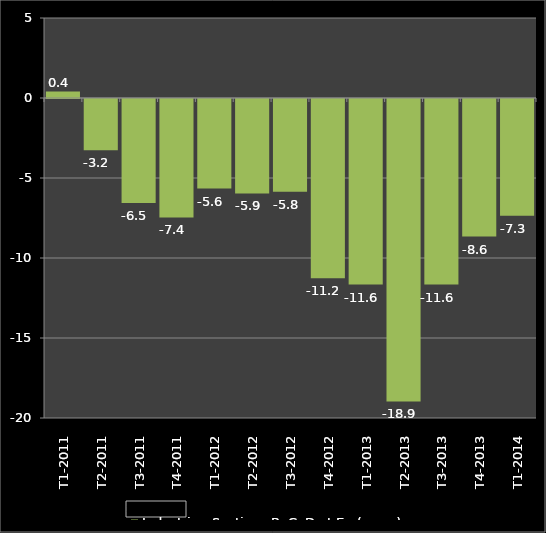
| Category | Industrie - Sections B, C, D et E - (c.v.s.) |
|---|---|
|  T1-2011 | 0.4 |
|  T2-2011 | -3.2 |
|  T3-2011 | -6.5 |
|  T4-2011 | -7.4 |
|  T1-2012 | -5.6 |
|  T2-2012 | -5.9 |
|  T3-2012 | -5.8 |
|  T4-2012 | -11.2 |
|  T1-2013 | -11.6 |
|  T2-2013 | -18.9 |
|  T3-2013 | -11.6 |
|  T4-2013 | -8.6 |
|  T1-2014 | -7.3 |